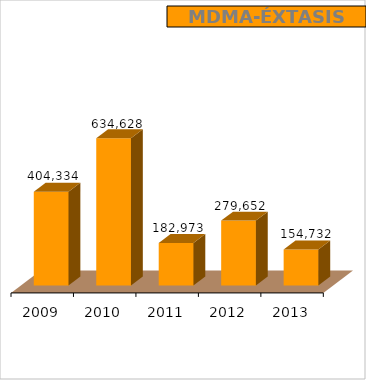
| Category | MDMA-Éxtasis |
|---|---|
| 2009.0 | 404334 |
| 2010.0 | 634628 |
| 2011.0 | 182973 |
| 2012.0 | 279652 |
| 2013.0 | 154732 |